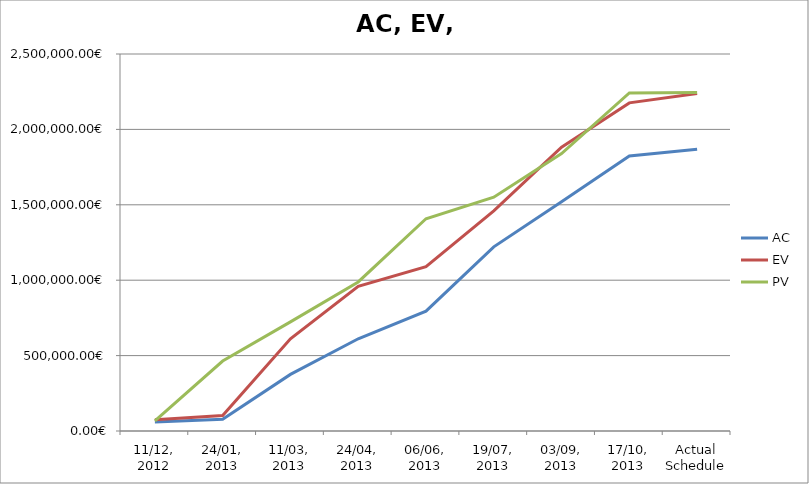
| Category | AC | EV | PV |
|---|---|---|---|
| 11/12, 2012 | 60167.12 | 74554.575 | 66790.8 |
| 24/01, 2013 | 77307.92 | 102786.48 | 463759.682 |
| 11/03, 2013 | 375237.682 | 611796.685 | 723746.983 |
| 24/04, 2013 | 611809.523 | 959188.016 | 988580.706 |
| 06/06, 2013 | 795003.712 | 1090007.566 | 1407361.607 |
| 19/07, 2013 | 1221194.351 | 1460018.337 | 1550527.85 |
| 03/09, 2013 | 1519412.277 | 1881917.373 | 1839603.051 |
| 17/10, 2013 | 1823813.562 | 2175895.37 | 2241863.54 |
| Actual Schedule | 1868796.284 | 2237845.539 | 2244090.74 |